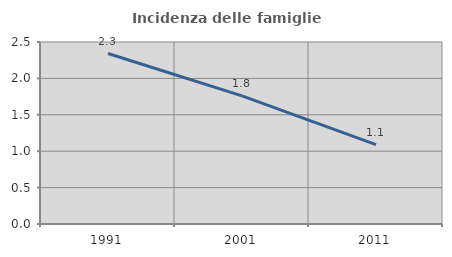
| Category | Incidenza delle famiglie numerose |
|---|---|
| 1991.0 | 2.342 |
| 2001.0 | 1.759 |
| 2011.0 | 1.09 |